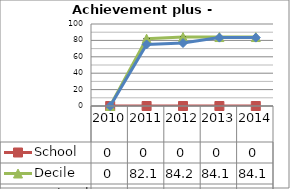
| Category | School  | Decile | National |
|---|---|---|---|
| 2010.0 | 0 | 0 | 0 |
| 2011.0 | 0 | 82.1 | 75.1 |
| 2012.0 | 0 | 84.2 | 76.8 |
| 2013.0 | 0 | 84.1 | 83.4 |
| 2014.0 | 0 | 84.1 | 83.4 |